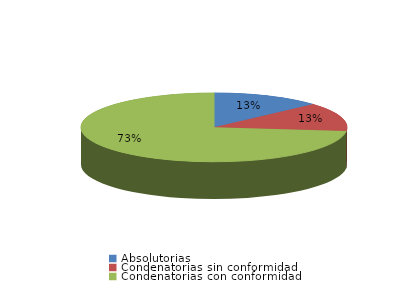
| Category | Series 0 |
|---|---|
| Absolutorias | 83 |
| Condenatorias sin conformidad | 84 |
| Condenatorias con conformidad | 458 |